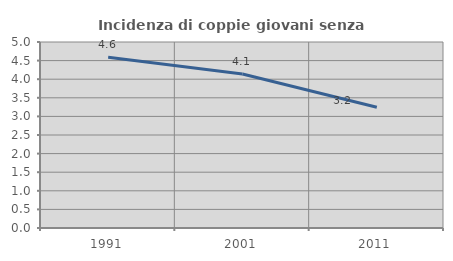
| Category | Incidenza di coppie giovani senza figli |
|---|---|
| 1991.0 | 4.59 |
| 2001.0 | 4.138 |
| 2011.0 | 3.248 |